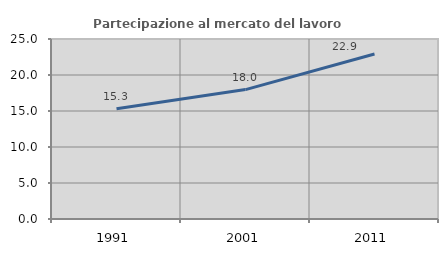
| Category | Partecipazione al mercato del lavoro  femminile |
|---|---|
| 1991.0 | 15.323 |
| 2001.0 | 17.972 |
| 2011.0 | 22.92 |